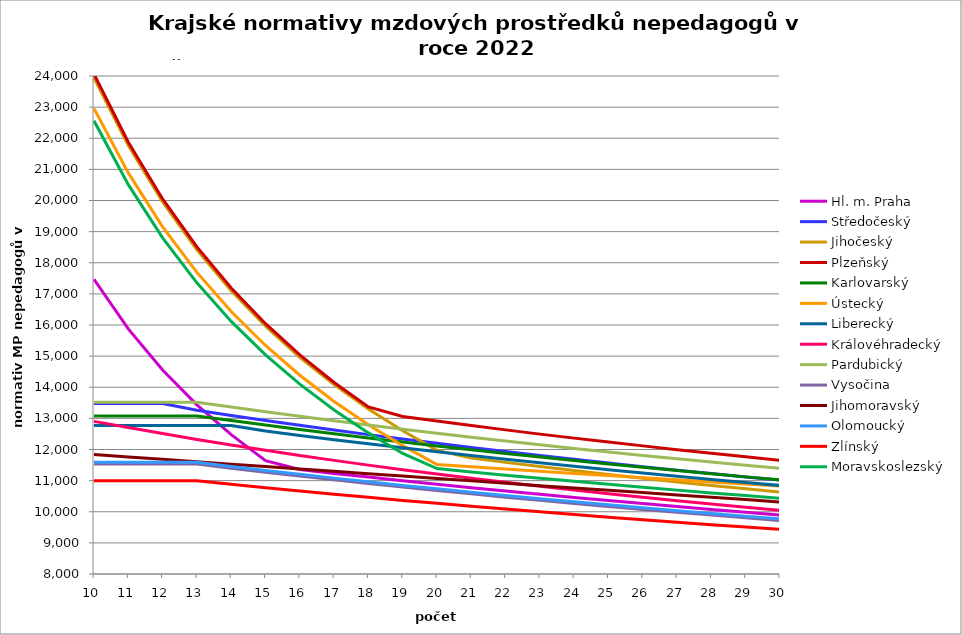
| Category | Hl. m. Praha | Středočeský | Jihočeský | Plzeňský | Karlovarský  | Ústecký   | Liberecký | Královéhradecký | Pardubický | Vysočina | Jihomoravský | Olomoucký | Zlínský | Moravskoslezský |
|---|---|---|---|---|---|---|---|---|---|---|---|---|---|---|
| 10.0 | 17466.831 | 13474.444 | 23942.304 | 24061 | 13079.309 | 22960.815 | 12770.985 | 12903.738 | 13519.044 | 11532.848 | 11842.105 | 11593.122 | 10994.974 | 22560 |
| 11.0 | 15874.497 | 13474.444 | 21765.731 | 21873.636 | 13079.309 | 20886.183 | 12770.985 | 12704.407 | 13519.044 | 11532.848 | 11757.269 | 11593.122 | 10994.974 | 20509.091 |
| 12.0 | 14555.692 | 13474.444 | 19951.92 | 20050.833 | 13079.309 | 19155.391 | 12770.985 | 12511.141 | 13519.044 | 11532.848 | 11683.417 | 11593.122 | 10994.974 | 18800 |
| 13.0 | 13432.844 | 13259.201 | 18417.157 | 18508.462 | 13079.425 | 17689.501 | 12770.985 | 12323.667 | 13519.044 | 11532.848 | 11605.657 | 11593.122 | 10994.974 | 17353.846 |
| 14.0 | 12476.308 | 13092.983 | 17101.646 | 17186.429 | 12929.335 | 16432.021 | 12770.985 | 12147.003 | 13364.028 | 11400.57 | 11528.926 | 11456.732 | 10882.85 | 16114.286 |
| 15.0 | 11642.166 | 12931.988 | 15961.536 | 16040.667 | 12783.648 | 15341.454 | 12591.093 | 11975.332 | 13213.443 | 11272.173 | 11453.202 | 11328.393 | 10773.736 | 15040 |
| 16.0 | 11357.983 | 12775.987 | 14963.94 | 15038.125 | 12642.182 | 14386.636 | 12450.554 | 11808.446 | 13067.22 | 11147.498 | 11373.828 | 11202.897 | 10667.521 | 14100 |
| 17.0 | 11232.133 | 12624.76 | 14083.708 | 14153.529 | 12504.766 | 13543.706 | 12314.064 | 11651 | 12925.184 | 11026.394 | 11300.122 | 11080.152 | 10564.099 | 13270.588 |
| 18.0 | 11113.391 | 12478.103 | 13301.28 | 13367.222 | 12371.238 | 12794.086 | 12181.461 | 11497.697 | 12787.167 | 10908.307 | 11222.848 | 10964.637 | 10463.367 | 12533.333 |
| 19.0 | 10997.133 | 12335.822 | 12601.213 | 13058.887 | 12241.445 | 12123.094 | 12052.591 | 11352.984 | 12653.011 | 10793.934 | 11146.624 | 10847.03 | 10365.23 | 11873.684 |
| 20.0 | 10883.282 | 12197.735 | 11971.152 | 12912.88 | 12115.243 | 11518.975 | 11927.307 | 11211.868 | 12522.565 | 10682.726 | 11067.037 | 10736.301 | 10269.595 | 11386.578 |
| 21.0 | 10771.765 | 12063.67 | 11724.949 | 12770.102 | 11992.493 | 11445.92 | 11805.471 | 11074.218 | 12395.688 | 10574.563 | 10992.908 | 10627.809 | 10176.376 | 11280.023 |
| 22.0 | 10666.516 | 11933.463 | 11586.18 | 12630.446 | 11873.064 | 11373.782 | 11686.952 | 10944.188 | 12272.245 | 10469.328 | 10915.493 | 10521.489 | 10085.489 | 11176.195 |
| 23.0 | 10563.305 | 11806.961 | 11452.134 | 12493.812 | 11756.834 | 11302.547 | 11571.625 | 10817.176 | 12152.107 | 10366.54 | 10839.161 | 10421.403 | 9996.854 | 11075.002 |
| 24.0 | 10458.217 | 11684.017 | 11322.598 | 12365.396 | 11643.684 | 11232.199 | 11459.372 | 10697.169 | 12035.153 | 10266.847 | 10763.889 | 10319.152 | 9910.395 | 10976.35 |
| 25.0 | 10358.978 | 11564.493 | 11197.371 | 12239.593 | 11533.503 | 11162.722 | 11350.08 | 10575.794 | 11921.267 | 10169.771 | 10689.655 | 10222.862 | 9826.041 | 10880.154 |
| 26.0 | 10261.605 | 11448.258 | 11076.266 | 12116.324 | 11426.183 | 11094.098 | 11243.643 | 10464.97 | 11810.338 | 10075.218 | 10616.438 | 10128.351 | 9743.722 | 10786.331 |
| 27.0 | 10169.688 | 11335.187 | 10959.105 | 11995.513 | 11321.623 | 11026.314 | 11139.959 | 10352.61 | 11702.264 | 9982.753 | 10540.234 | 10035.573 | 9663.372 | 10694.802 |
| 28.0 | 10075.825 | 11225.163 | 10845.721 | 11877.088 | 11219.727 | 10959.352 | 11038.93 | 10246.391 | 11596.942 | 9893.328 | 10465.116 | 9944.478 | 9584.927 | 10605.491 |
| 29.0 | 9983.679 | 11118.074 | 10735.957 | 11765.77 | 11120.403 | 10893.199 | 10940.465 | 10142.329 | 11494.279 | 9805.49 | 10391.061 | 9855.022 | 9508.328 | 10518.326 |
| 30.0 | 9896.653 | 11013.812 | 10629.666 | 11651.816 | 11023.563 | 10827.84 | 10844.475 | 10043.966 | 11394.183 | 9720.182 | 10314.233 | 9770.792 | 9433.517 | 10433.238 |